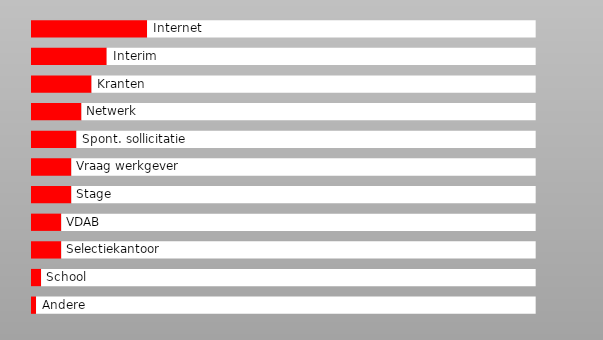
| Category | Series 0 | Series 1 | Series 2 |
|---|---|---|---|
| Andere | 0.07 | 0.01 | 0.99 |
| School | 0.07 | 0.02 | 0.98 |
| Selectiekantoor | 0.07 | 0.06 | 0.94 |
| VDAB | 0.07 | 0.06 | 0.94 |
| Stage | 0.07 | 0.08 | 0.92 |
| Vraag werkgever | 0.07 | 0.08 | 0.92 |
| Spont. sollicitatie | 0.07 | 0.09 | 0.91 |
| Netwerk | 0.07 | 0.1 | 0.9 |
| Kranten | 0.07 | 0.12 | 0.88 |
| Interim | 0.07 | 0.15 | 0.85 |
| Internet | 0.07 | 0.23 | 0.77 |